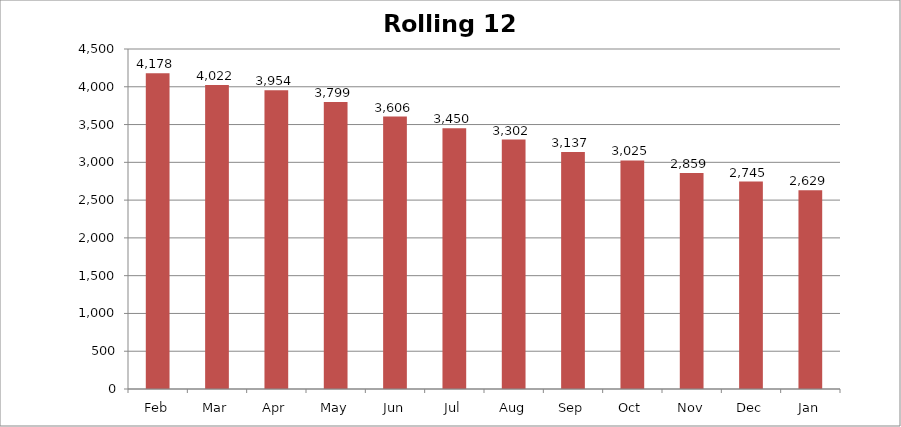
| Category | Rolling 12 Month |
|---|---|
| Feb | 4178 |
| Mar | 4022 |
| Apr | 3954 |
| May | 3799 |
| Jun | 3606 |
| Jul | 3450 |
| Aug | 3302 |
| Sep | 3137 |
| Oct | 3025 |
| Nov | 2859 |
| Dec | 2745 |
| Jan | 2629 |